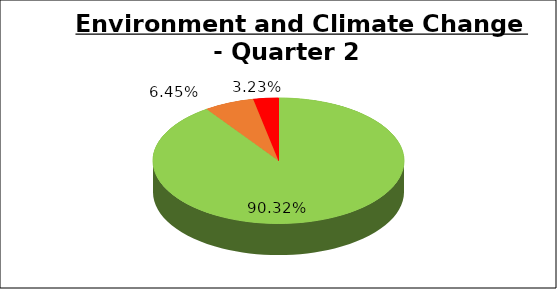
| Category | Q2 |
|---|---|
| Green | 0.903 |
| Amber | 0.065 |
| Red | 0.032 |